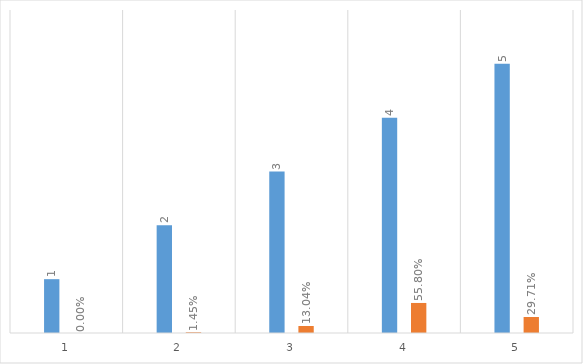
| Category | Series 0 | Series 1 |
|---|---|---|
| 0 | 1 | 0 |
| 1 | 2 | 0.014 |
| 2 | 3 | 0.13 |
| 3 | 4 | 0.558 |
| 4 | 5 | 0.297 |